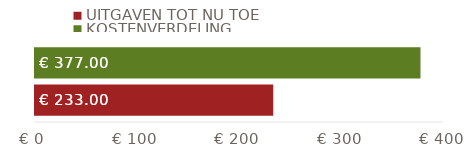
| Category | UITGAVEN TOT NU TOE | KOSTENVERDELING |
|---|---|---|
| TOTALEN | 233 | 377 |